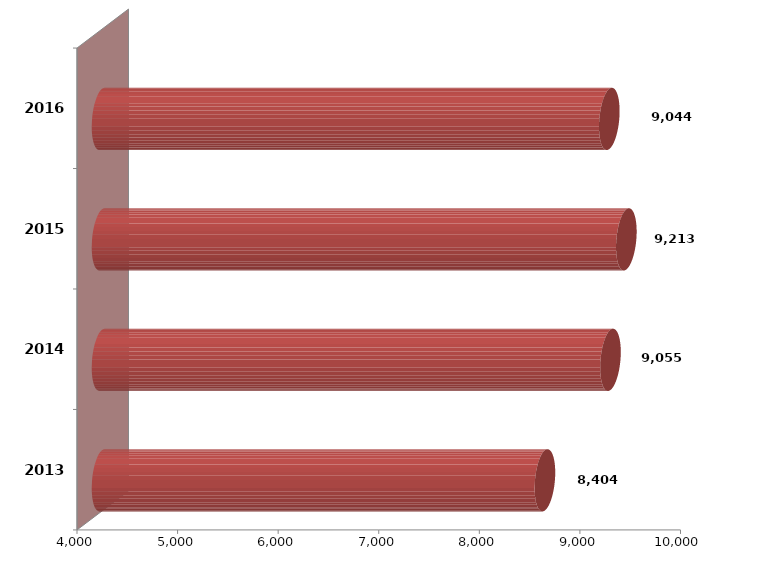
| Category | Series 1 | Series 2 |
|---|---|---|
| 2013.0 | 8403607 |  |
| 2014.0 | 9055300 |  |
| 2015.0 | 9213152 |  |
| 2016.0 | 9043605.283 |  |